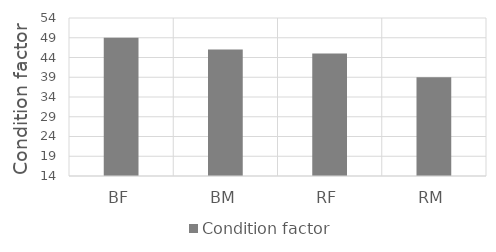
| Category | Condition factor |
|---|---|
| BF | 49 |
| BM | 46 |
| RF | 45 |
| RM | 39 |